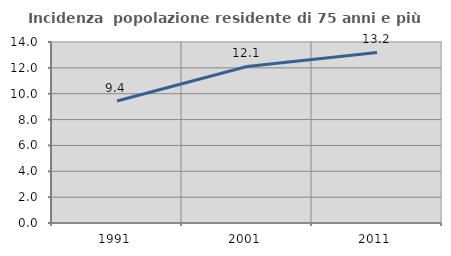
| Category | Incidenza  popolazione residente di 75 anni e più |
|---|---|
| 1991.0 | 9.434 |
| 2001.0 | 12.105 |
| 2011.0 | 13.192 |